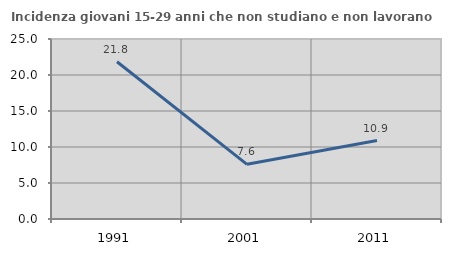
| Category | Incidenza giovani 15-29 anni che non studiano e non lavorano  |
|---|---|
| 1991.0 | 21.839 |
| 2001.0 | 7.591 |
| 2011.0 | 10.892 |